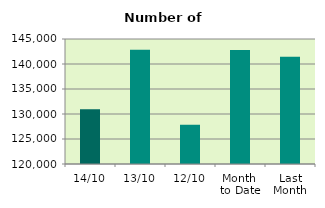
| Category | Series 0 |
|---|---|
| 14/10 | 130942 |
| 13/10 | 142838 |
| 12/10 | 127850 |
| Month 
to Date | 142782.6 |
| Last
Month | 141428.727 |